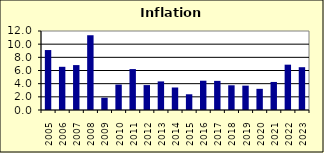
| Category | 5.6 |
|---|---|
| 2005.0 | 9.107 |
| 2006.0 | 6.562 |
| 2007.0 | 6.822 |
| 2008.0 | 11.355 |
| 2009.0 | 1.86 |
| 2010.0 | 3.86 |
| 2011.0 | 6.215 |
| 2012.0 | 3.783 |
| 2013.0 | 4.343 |
| 2014.0 | 3.418 |
| 2015.0 | 2.389 |
| 2016.0 | 4.448 |
| 2017.0 | 4.425 |
| 2018.0 | 3.752 |
| 2019.0 | 3.7 |
| 2020.0 | 3.214 |
| 2021.0 | 4.261 |
| 2022.0 | 6.885 |
| 2023.0 | 6.5 |